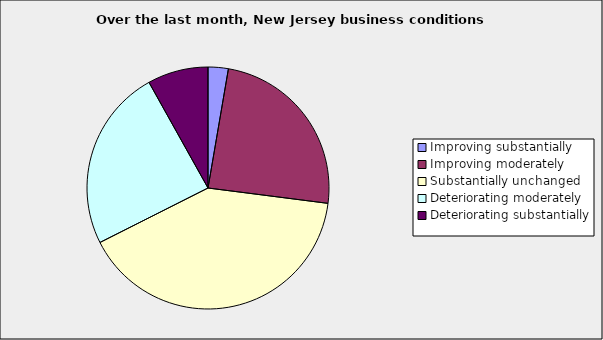
| Category | Series 0 |
|---|---|
| Improving substantially | 0.027 |
| Improving moderately | 0.243 |
| Substantially unchanged | 0.405 |
| Deteriorating moderately | 0.243 |
| Deteriorating substantially | 0.081 |